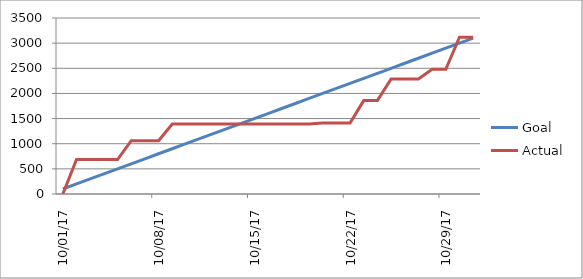
| Category | Goal | Actual |
|---|---|---|
| 2017-10-01 | 100 | 0 |
| 2017-10-02 | 200 | 685 |
| 2017-10-03 | 300 | 685 |
| 2017-10-04 | 400 | 685 |
| 2017-10-05 | 500 | 685 |
| 2017-10-06 | 600 | 1061 |
| 2017-10-07 | 700 | 1061 |
| 2017-10-08 | 800 | 1061 |
| 2017-10-09 | 900 | 1392 |
| 2017-10-10 | 1000 | 1392 |
| 2017-10-11 | 1100 | 1392 |
| 2017-10-12 | 1200 | 1392 |
| 2017-10-13 | 1300 | 1392 |
| 2017-10-14 | 1400 | 1392 |
| 2017-10-15 | 1500 | 1392 |
| 2017-10-16 | 1600 | 1392 |
| 2017-10-17 | 1700 | 1392 |
| 2017-10-18 | 1800 | 1392 |
| 2017-10-19 | 1900 | 1392 |
| 2017-10-20 | 2000 | 1412 |
| 2017-10-21 | 2100 | 1412 |
| 2017-10-22 | 2200 | 1412 |
| 2017-10-23 | 2300 | 1857 |
| 2017-10-24 | 2400 | 1857 |
| 2017-10-25 | 2500 | 2286 |
| 2017-10-26 | 2600 | 2286 |
| 2017-10-27 | 2700 | 2286 |
| 2017-10-28 | 2800 | 2479 |
| 2017-10-29 | 2900 | 2479 |
| 2017-10-30 | 3000 | 3119 |
| 2017-10-31 | 3100 | 3119 |